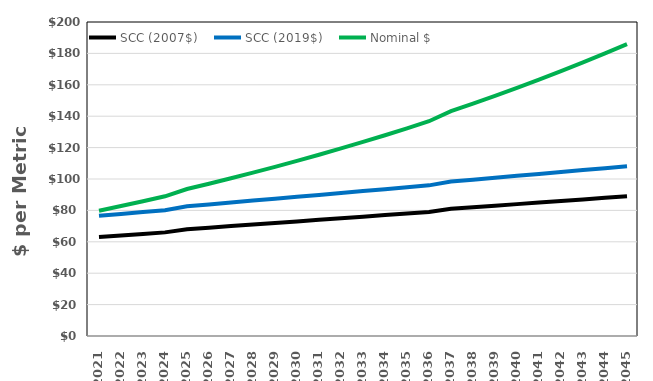
| Category | SCC (2007$) | SCC (2019$) | Nominal $ |
|---|---|---|---|
| 2021.0 | 63 | 76.52 | 79.779 |
| 2022.0 | 64 | 77.734 | 82.754 |
| 2023.0 | 65 | 78.949 | 85.818 |
| 2024.0 | 66 | 80.164 | 88.975 |
| 2025.0 | 68 | 82.593 | 93.603 |
| 2026.0 | 69 | 83.807 | 96.981 |
| 2027.0 | 70 | 85.022 | 100.461 |
| 2028.0 | 71 | 86.237 | 104.043 |
| 2029.0 | 72 | 87.451 | 107.732 |
| 2030.0 | 73 | 88.666 | 111.531 |
| 2031.0 | 74 | 89.88 | 115.441 |
| 2032.0 | 75 | 91.095 | 119.467 |
| 2033.0 | 76 | 92.31 | 123.612 |
| 2034.0 | 77 | 93.524 | 127.878 |
| 2035.0 | 78 | 94.739 | 132.268 |
| 2036.0 | 79 | 95.953 | 136.788 |
| 2037.0 | 81 | 98.383 | 143.207 |
| 2038.0 | 82 | 99.597 | 148.03 |
| 2039.0 | 83 | 100.812 | 152.993 |
| 2040.0 | 84 | 102.026 | 158.1 |
| 2041.0 | 85 | 103.241 | 163.354 |
| 2042.0 | 86 | 104.456 | 168.759 |
| 2043.0 | 87 | 105.67 | 174.319 |
| 2044.0 | 88 | 106.885 | 180.039 |
| 2045.0 | 89 | 108.099 | 185.923 |